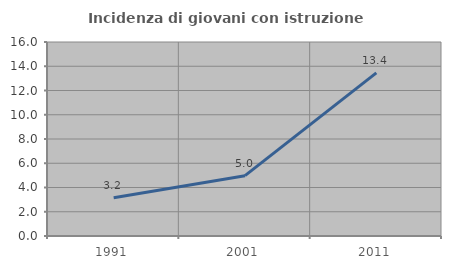
| Category | Incidenza di giovani con istruzione universitaria |
|---|---|
| 1991.0 | 3.163 |
| 2001.0 | 4.974 |
| 2011.0 | 13.448 |